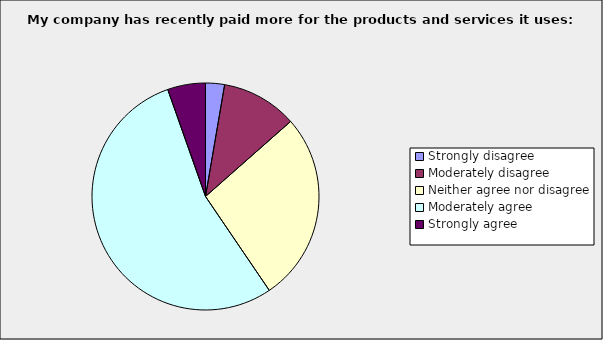
| Category | Series 0 |
|---|---|
| Strongly disagree | 0.027 |
| Moderately disagree | 0.108 |
| Neither agree nor disagree | 0.27 |
| Moderately agree | 0.541 |
| Strongly agree | 0.054 |